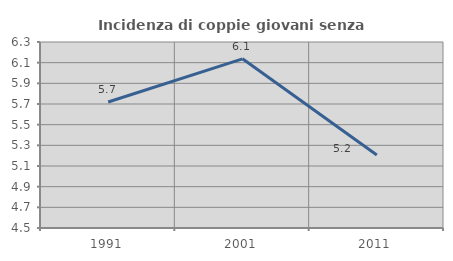
| Category | Incidenza di coppie giovani senza figli |
|---|---|
| 1991.0 | 5.719 |
| 2001.0 | 6.137 |
| 2011.0 | 5.206 |